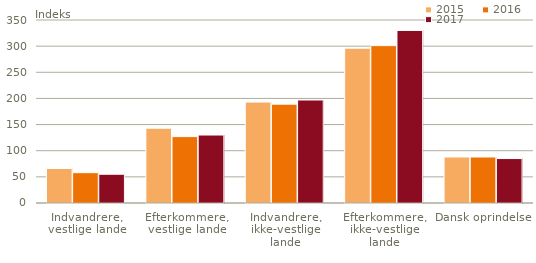
| Category | 2015 | 2016 | 2017 |
|---|---|---|---|
| Indvandrere,
vestlige lande | 66 | 58 | 55 |
| Efterkommere,
vestlige lande | 143 | 127 | 130 |
| Indvandrere,
ikke-vestlige lande | 193 | 189 | 197 |
| Efterkommere,
ikke-vestlige lande | 296 | 301 | 330 |
| Dansk oprindelse | 88 | 88 | 85 |